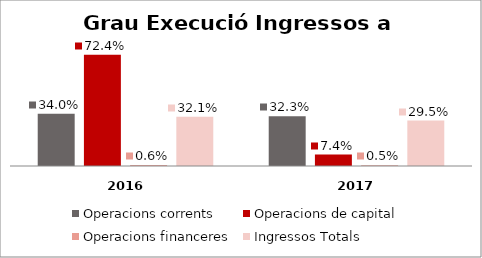
| Category | Operacions corrents | Operacions de capital | Operacions financeres | Ingressos Totals |
|---|---|---|---|---|
| 0 | 0.34 | 0.724 | 0.006 | 0.321 |
| 1 | 0.323 | 0.074 | 0.005 | 0.295 |